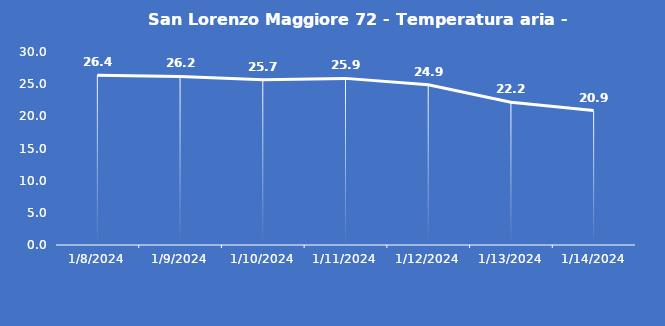
| Category | San Lorenzo Maggiore 72 - Temperatura aria - Grezzo (°C) |
|---|---|
| 1/8/24 | 26.4 |
| 1/9/24 | 26.2 |
| 1/10/24 | 25.7 |
| 1/11/24 | 25.9 |
| 1/12/24 | 24.9 |
| 1/13/24 | 22.2 |
| 1/14/24 | 20.9 |